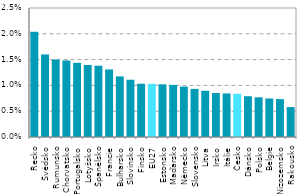
| Category | Series 0 |
|---|---|
| Řecko | 0.02 |
| Švédsko | 0.016 |
| Rumunsko | 0.015 |
| Chorvatsko | 0.015 |
| Portugalsko | 0.014 |
| Lotyšsko | 0.014 |
| Španělsko | 0.014 |
| Francie | 0.013 |
| Bulharsko | 0.012 |
| Slovinsko | 0.011 |
| Finsko | 0.01 |
| EU27 | 0.01 |
| Estonsko | 0.01 |
| Maďarsko | 0.01 |
| Německo | 0.01 |
| Slovensko | 0.009 |
| Litva | 0.009 |
| Irsko | 0.009 |
| Itálie | 0.008 |
| Česko | 0.008 |
| Dánsko | 0.008 |
| Polsko | 0.008 |
| Belgie | 0.007 |
| Nizozemsko | 0.007 |
| Rakousko | 0.006 |